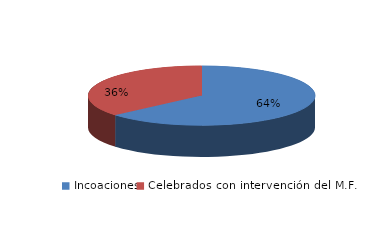
| Category | Series 0 |
|---|---|
| Incoaciones | 959 |
| Celebrados con intervención del M.F. | 547 |